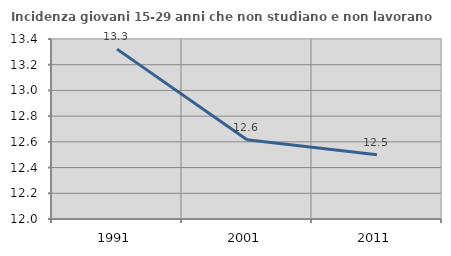
| Category | Incidenza giovani 15-29 anni che non studiano e non lavorano  |
|---|---|
| 1991.0 | 13.321 |
| 2001.0 | 12.617 |
| 2011.0 | 12.5 |